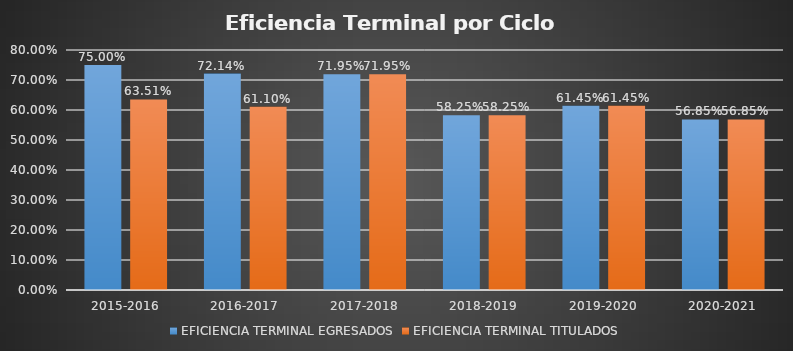
| Category | EFICIENCIA TERMINAL EGRESADOS | EFICIENCIA TERMINAL TITULADOS |
|---|---|---|
| 2015-2016 | 0.75 | 0.635 |
| 2016-2017 | 0.721 | 0.611 |
| 2017-2018 | 0.72 | 0.72 |
| 2018-2019 | 0.582 | 0.582 |
| 2019-2020 | 0.614 | 0.614 |
| 2020-2021 | 0.568 | 0.568 |